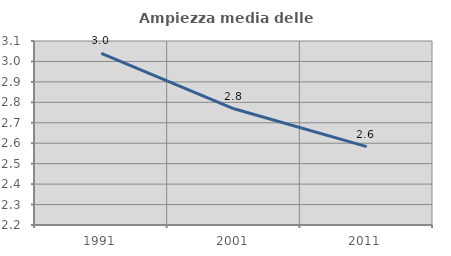
| Category | Ampiezza media delle famiglie |
|---|---|
| 1991.0 | 3.039 |
| 2001.0 | 2.769 |
| 2011.0 | 2.583 |